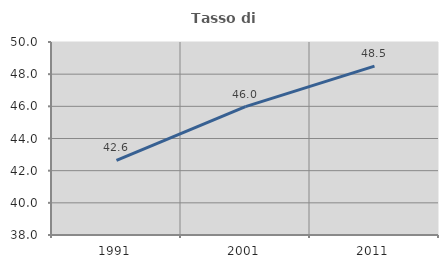
| Category | Tasso di occupazione   |
|---|---|
| 1991.0 | 42.645 |
| 2001.0 | 45.985 |
| 2011.0 | 48.501 |